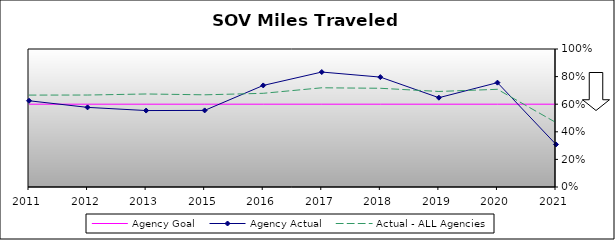
| Category | Agency Goal | Agency Actual | Actual - ALL Agencies |
|---|---|---|---|
| 2011.0 | 0.6 | 0.625 | 0.666 |
| 2012.0 | 0.6 | 0.577 | 0.666 |
| 2013.0 | 0.6 | 0.554 | 0.674 |
| 2015.0 | 0.6 | 0.555 | 0.668 |
| 2016.0 | 0.6 | 0.736 | 0.679 |
| 2017.0 | 0.6 | 0.833 | 0.719 |
| 2018.0 | 0.6 | 0.796 | 0.715 |
| 2019.0 | 0.6 | 0.647 | 0.692 |
| 2020.0 | 0.6 | 0.756 | 0.708 |
| 2021.0 | 0.6 | 0.308 | 0.467 |